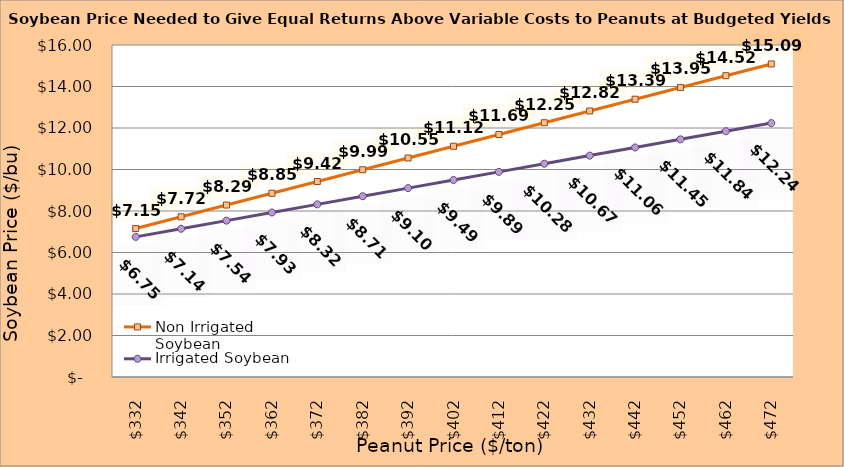
| Category | Non Irrigated Soybean | Irrigated Soybean |
|---|---|---|
| 332.02127659574467 | 7.154 | 6.753 |
| 342.02127659574467 | 7.721 | 7.145 |
| 352.02127659574467 | 8.287 | 7.537 |
| 362.02127659574467 | 8.854 | 7.928 |
| 372.02127659574467 | 9.421 | 8.32 |
| 382.02127659574467 | 9.987 | 8.712 |
| 392.02127659574467 | 10.554 | 9.103 |
| 402.02127659574467 | 11.121 | 9.495 |
| 412.02127659574467 | 11.687 | 9.887 |
| 422.02127659574467 | 12.254 | 10.278 |
| 432.02127659574467 | 12.821 | 10.67 |
| 442.02127659574467 | 13.387 | 11.062 |
| 452.02127659574467 | 13.954 | 11.453 |
| 462.02127659574467 | 14.521 | 11.845 |
| 472.02127659574467 | 15.087 | 12.237 |